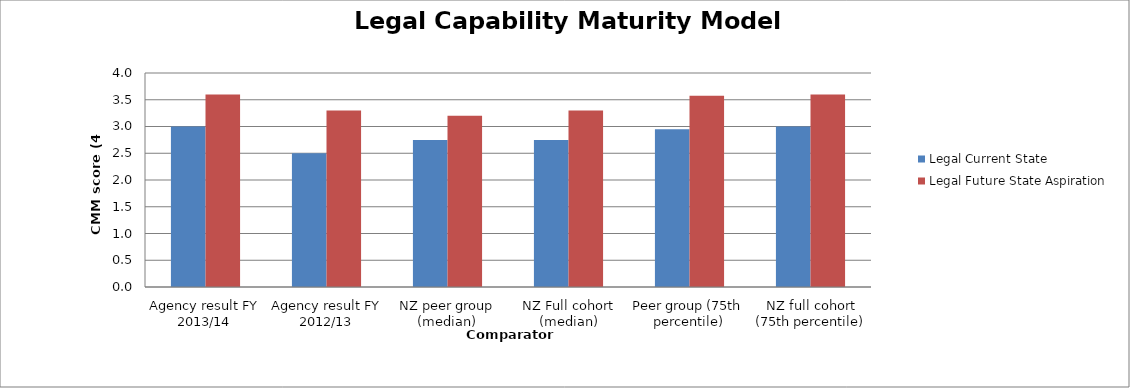
| Category | Legal Current State | Legal Future State Aspiration |
|---|---|---|
| Agency result FY 2013/14 | 3 | 3.6 |
| Agency result FY 2012/13 | 2.5 | 3.3 |
| NZ peer group (median) | 2.75 | 3.2 |
| NZ Full cohort (median) | 2.75 | 3.3 |
| Peer group (75th percentile) | 2.95 | 3.575 |
| NZ full cohort (75th percentile) | 3 | 3.6 |